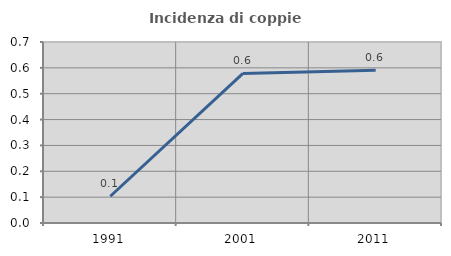
| Category | Incidenza di coppie miste |
|---|---|
| 1991.0 | 0.103 |
| 2001.0 | 0.579 |
| 2011.0 | 0.591 |